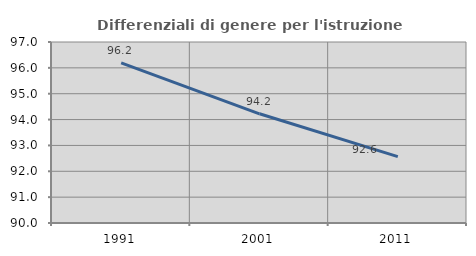
| Category | Differenziali di genere per l'istruzione superiore |
|---|---|
| 1991.0 | 96.193 |
| 2001.0 | 94.224 |
| 2011.0 | 92.569 |